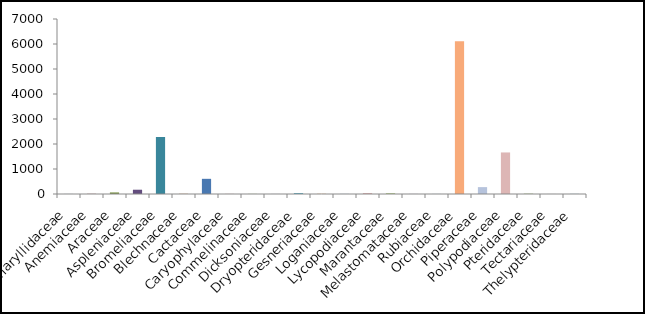
| Category | Quantidade |
|---|---|
| Amaryllidaceae | 2 |
| Anemiaceae | 7 |
| Araceae | 63 |
| Aspleniaceae | 171 |
| Bromeliaceae | 2280 |
| Blechnaceae | 8 |
| Cactaceae | 607 |
| Caryophylaceae | 3 |
| Commelinaceae | 4 |
| Dicksoniaceae | 2 |
| Dryopteridaceae | 36 |
| Gesneriaceae | 7 |
| Loganiaceae | 4 |
| Lycopodiaceae | 24 |
| Marantaceae | 35 |
| Melastomataceae | 3 |
| Rubiaceae | 3 |
| Orchidaceae | 6113 |
| Piperaceae | 275 |
| Polypodiaceae | 1662 |
| Pteridaceae | 28 |
| Tectariaceae | 2 |
| Thelypteridaceae | 10 |